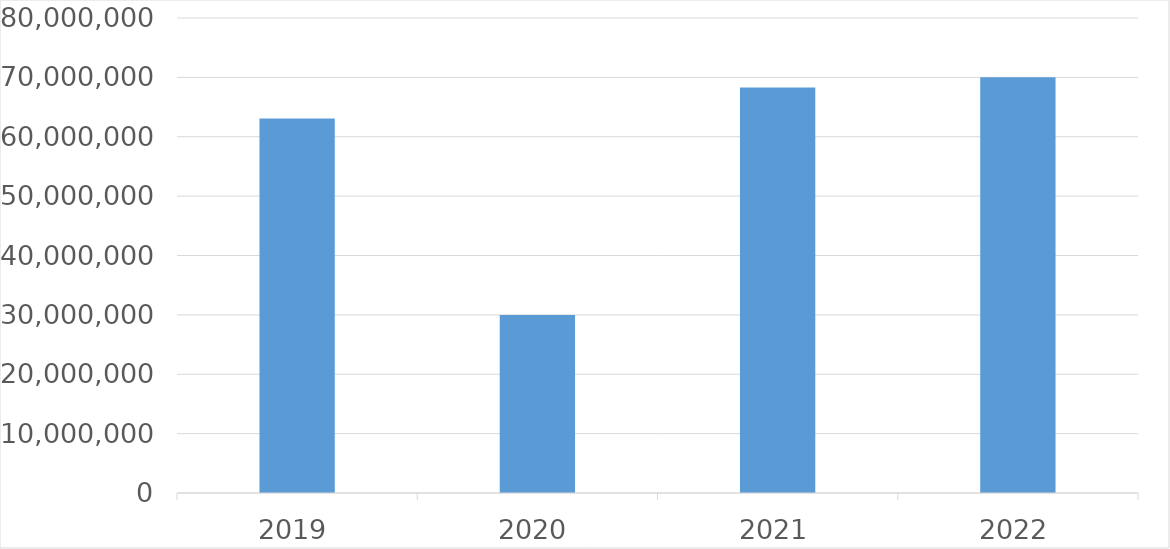
| Category | Series 0 |
|---|---|
| 2019 | 63075063 |
| 2020 | 30000000 |
| 2021 | 68287928 |
| 2022 | 70026281 |